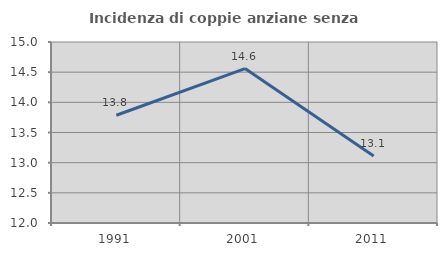
| Category | Incidenza di coppie anziane senza figli  |
|---|---|
| 1991.0 | 13.786 |
| 2001.0 | 14.559 |
| 2011.0 | 13.112 |